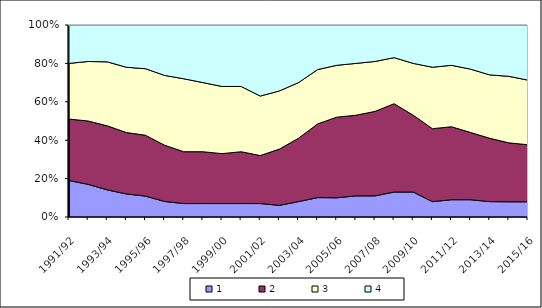
| Category | Number of bedrooms | 1 | 2 | 3 | 4 |
|---|---|---|---|---|---|
| 1991/92 |  | 19 | 32 | 29 | 20 |
| 1992/93 |  | 17 | 33 | 31 | 19 |
| 1993/94 |  | 14 | 33 | 33 | 19 |
| 1994/95 |  | 12 | 32 | 34 | 22 |
| 1995/96 |  | 11 | 32 | 35 | 23 |
| 1996/97 |  | 8 | 29 | 36 | 26 |
| 1997/98 |  | 7 | 27 | 38 | 28 |
| 1998/99 |  | 7 | 27 | 36 | 30 |
| 1999/00 |  | 7 | 26 | 35 | 32 |
| 2000/01 |  | 7 | 27 | 34 | 32 |
| 2001/02 |  | 7 | 25 | 31 | 37 |
| 2002/03 |  | 6 | 29 | 30 | 34 |
| 2003/04 |  | 8 | 33 | 29 | 30 |
| 2004/05 |  | 10 | 38 | 28 | 23 |
| 2005/06 |  | 10 | 42 | 27 | 21 |
| 2006/07 |  | 11 | 42 | 27 | 20 |
| 2007/08 |  | 11 | 44 | 26 | 19 |
| 2008/09 |  | 13 | 46 | 24 | 17 |
| 2009/10 |  | 13 | 40 | 27 | 20 |
| 2010/11 |  | 8 | 38 | 32 | 22 |
| 2011/12 |  | 9 | 38 | 32 | 21 |
| 2012/13 |  | 9 | 35 | 33 | 23 |
| 2013/14 |  | 8 | 33 | 33 | 26 |
| 2014/15 |  | 8 | 31 | 35 | 27 |
| 2015/16 |  | 8 | 30 | 34 | 29 |